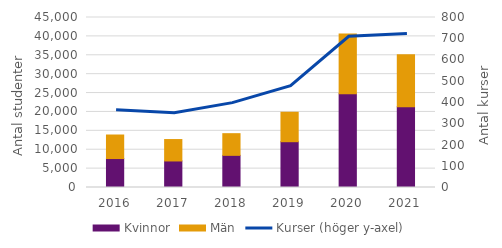
| Category | Kvinnor | Män |
|---|---|---|
| 2016 | 7666 | 6229 |
| 2017 | 7024 | 5670 |
| 2018 | 8509 | 5740 |
| 2019 | 12122 | 7796 |
| 2020 | 24797 | 15808 |
| 2021 | 21353 | 13813 |